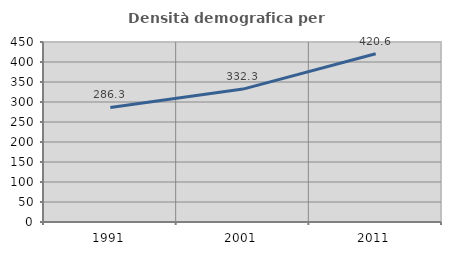
| Category | Densità demografica |
|---|---|
| 1991.0 | 286.331 |
| 2001.0 | 332.302 |
| 2011.0 | 420.572 |